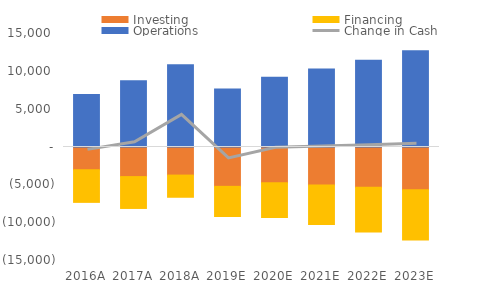
| Category | Investing | Financing | Operations |
|---|---|---|---|
| 2016.0 | -3005 | -4312 | 6935 |
| 2017.0 | -3911 | -4209 | 8749 |
| 2018.0 | -3710.835 | -2930.975 | 10882.594 |
| 2019.0 | -5199.198 | -3987.903 | 7678.623 |
| 2020.0 | -4739.926 | -4577.853 | 9229.634 |
| 2021.0 | -5024.322 | -5215.769 | 10305.181 |
| 2022.0 | -5325.781 | -5905.031 | 11464.048 |
| 2023.0 | -5645.328 | -6649.244 | 12711.986 |